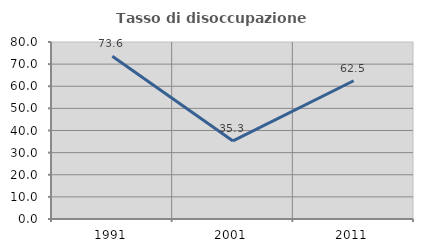
| Category | Tasso di disoccupazione giovanile  |
|---|---|
| 1991.0 | 73.563 |
| 2001.0 | 35.294 |
| 2011.0 | 62.5 |